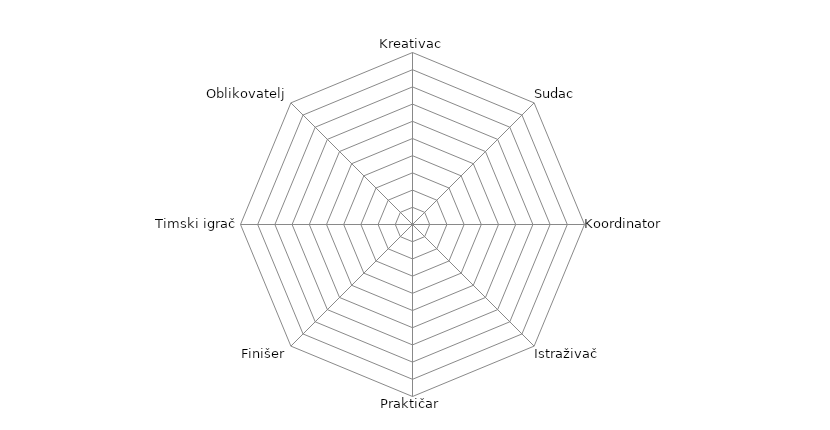
| Category | Series 0 |
|---|---|
| Kreativac | 0 |
| Sudac | 0 |
| Koordinator | 0 |
| Istraživač | 0 |
| Praktičar | 0 |
| Finišer | 0 |
| Timski igrač | 0 |
| Oblikovatelj | 0 |